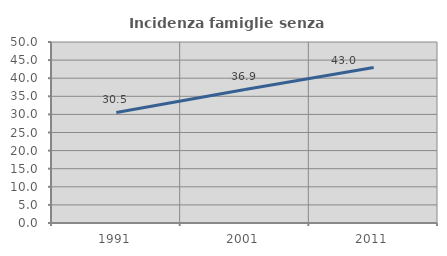
| Category | Incidenza famiglie senza nuclei |
|---|---|
| 1991.0 | 30.544 |
| 2001.0 | 36.884 |
| 2011.0 | 42.959 |